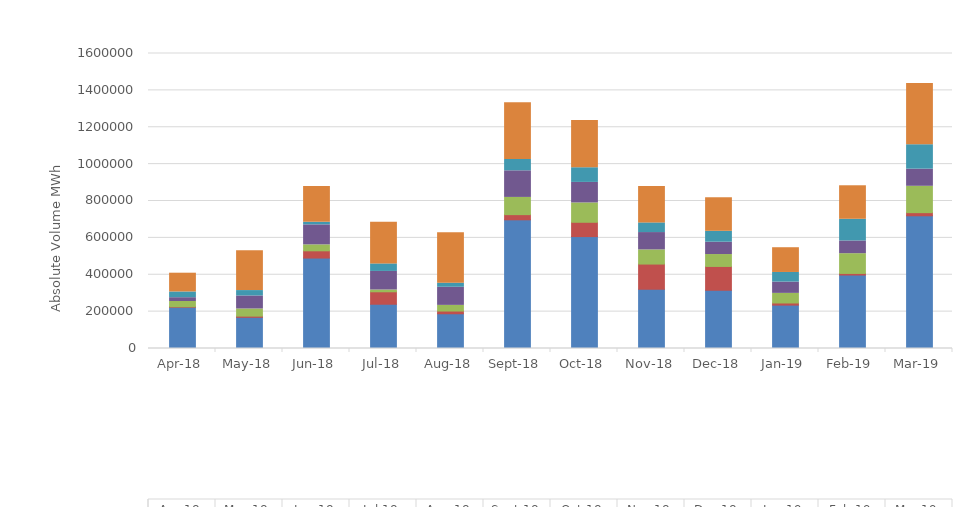
| Category | BM - Transmission | Trades - Transmission | BM - Voltage | Trades - Voltage | BM - ROCOF | Trades - ROCOF |
|---|---|---|---|---|---|---|
| 2018-04-01 | 223524.634 | 2867 | 28569.236 | 20584 | 31162.47 | 101715 |
| 2018-05-01 | 169041.237 | 6502.5 | 38818.622 | 70647.5 | 29151.454 | 215551 |
| 2018-06-01 | 490529.9 | 39289.4 | 32251.668 | 108480 | 14146.085 | 194531.5 |
| 2018-07-01 | 240083.216 | 67527 | 9742.691 | 100644.5 | 40904.042 | 226187 |
| 2018-08-01 | 188414.662 | 14720.2 | 30701.911 | 98325 | 22166.055 | 273122 |
| 2018-09-01 | 697941.339 | 28117.6 | 93318 | 144325.5 | 61303.894 | 307416 |
| 2018-10-01 | 606952.947 | 77645 | 104846.992 | 111349 | 79615.596 | 256073.5 |
| 2018-11-01 | 321460.438 | 136496.9 | 76759.901 | 94125 | 52451.07 | 198000.36 |
| 2018-12-01 | 315936.421 | 129143.4 | 64556.966 | 66899 | 59003.106 | 182049.5 |
| 2019-01-01 | 235331.037 | 11498.2 | 52110.022 | 61305 | 52123.797 | 134216 |
| 2019-02-01 | 398487.321 | 8676.9 | 107073.263 | 68992.5 | 117538.323 | 181819.8 |
| 2019-03-01 | 719804.989 | 16987.7 | 142915.089 | 92970.5 | 132488.81 | 331445.5 |